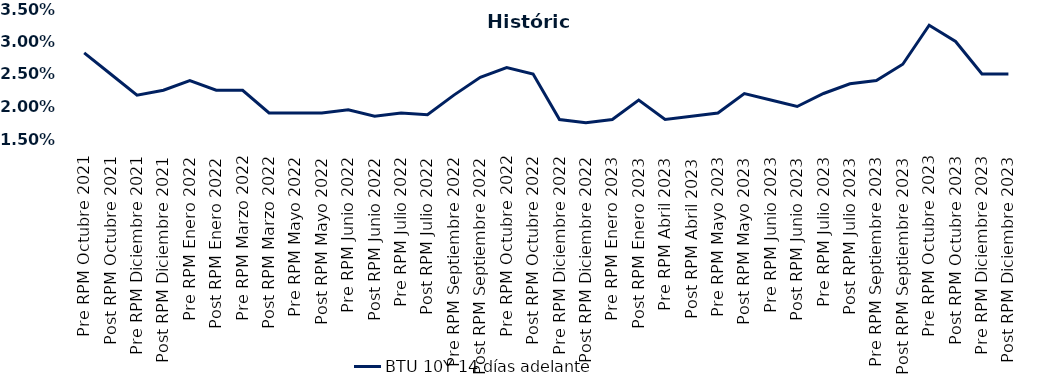
| Category | BTU 10Y 14 días adelante |
|---|---|
| Pre RPM Octubre 2021 | 0.028 |
| Post RPM Octubre 2021 | 0.025 |
| Pre RPM Diciembre 2021 | 0.022 |
| Post RPM Diciembre 2021 | 0.022 |
| Pre RPM Enero 2022 | 0.024 |
| Post RPM Enero 2022 | 0.022 |
| Pre RPM Marzo 2022 | 0.022 |
| Post RPM Marzo 2022 | 0.019 |
| Pre RPM Mayo 2022 | 0.019 |
| Post RPM Mayo 2022 | 0.019 |
| Pre RPM Junio 2022 | 0.02 |
| Post RPM Junio 2022 | 0.018 |
| Pre RPM Julio 2022 | 0.019 |
| Post RPM Julio 2022 | 0.019 |
| Pre RPM Septiembre 2022 | 0.022 |
| Post RPM Septiembre 2022 | 0.024 |
| Pre RPM Octubre 2022 | 0.026 |
| Post RPM Octubre 2022 | 0.025 |
| Pre RPM Diciembre 2022 | 0.018 |
| Post RPM Diciembre 2022 | 0.018 |
| Pre RPM Enero 2023 | 0.018 |
| Post RPM Enero 2023 | 0.021 |
| Pre RPM Abril 2023 | 0.018 |
| Post RPM Abril 2023 | 0.018 |
| Pre RPM Mayo 2023 | 0.019 |
| Post RPM Mayo 2023 | 0.022 |
| Pre RPM Junio 2023 | 0.021 |
| Post RPM Junio 2023 | 0.02 |
| Pre RPM Julio 2023 | 0.022 |
| Post RPM Julio 2023 | 0.024 |
| Pre RPM Septiembre 2023 | 0.024 |
| Post RPM Septiembre 2023 | 0.026 |
| Pre RPM Octubre 2023 | 0.032 |
| Post RPM Octubre 2023 | 0.03 |
| Pre RPM Diciembre 2023 | 0.025 |
| Post RPM Diciembre 2023 | 0.025 |